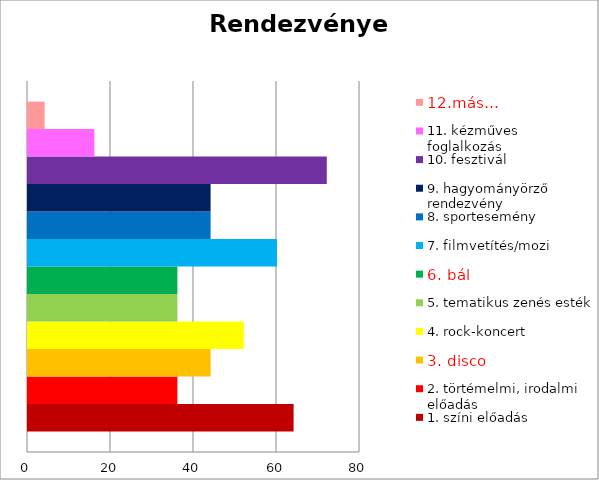
| Category | 1. színi előadás | 2. törtémelmi, irodalmi előadás | 3. disco | 4. rock-koncert | 5. tematikus zenés esték | 6. bál | 7. filmvetítés/mozi | 8. sportesemény | 9. hagyományörző rendezvény | 10. fesztivál | 11. kézműves foglalkozás | 12.más… |
|---|---|---|---|---|---|---|---|---|---|---|---|---|
| 0 | 64 | 36 | 44 | 52 | 36 | 36 | 60 | 44 | 44 | 72 | 16 | 4 |